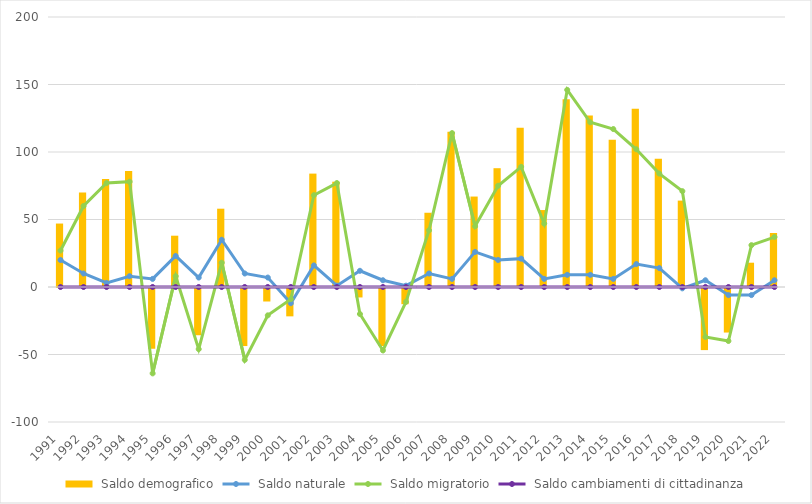
| Category |  Saldo demografico |
|---|---|
| 1991 | 47 |
| 1992 | 70 |
| 1993 | 80 |
| 1994 | 86 |
| 1995 | -45 |
| 1996 | 38 |
| 1997 | -35 |
| 1998 | 58 |
| 1999 | -43 |
| 2000 | -10 |
| 2001 | -21 |
| 2002 | 84 |
| 2003 | 78 |
| 2004 | -7 |
| 2005 | -43 |
| 2006 | -12 |
| 2007 | 55 |
| 2008 | 115 |
| 2009 | 67 |
| 2010 | 88 |
| 2011 | 118 |
| 2012 | 57 |
| 2013 | 139 |
| 2014 | 127 |
| 2015 | 109 |
| 2016 | 132 |
| 2017 | 95 |
| 2018 | 64 |
| 2019 | -46 |
| 2020 | -33 |
| 2021 | 18 |
| 2022 | 40 |